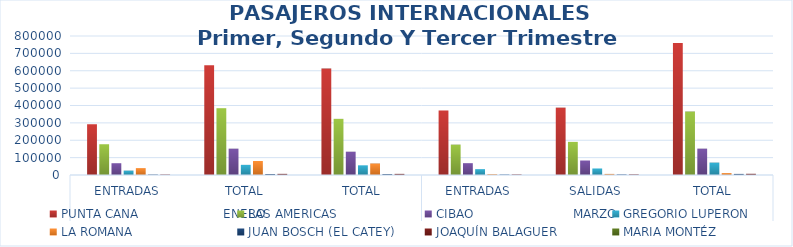
| Category | Series 0 | PUNTA CANA | LAS AMERICAS | CIBAO | GREGORIO LUPERON | LA ROMANA | JUAN BOSCH (EL CATEY) | JOAQUÍN BALAGUER | MARIA MONTÉZ |
|---|---|---|---|---|---|---|---|---|---|
| 0 |  | 292075 | 177067 | 67803 | 25212 | 39661 | 2610 | 2881 | 2 |
| 1 |  | 631955 | 384460 | 151453 | 58369 | 80531 | 5728 | 6563 | 10 |
| 2 |  | 612546 | 323088 | 134017 | 55751 | 66122 | 5481 | 6492 | 9 |
| 3 |  | 371356 | 174766 | 68083 | 33724 | 4810 | 2853 | 3228 | 1 |
| 4 |  | 387718 | 190545 | 83480 | 37607 | 6292 | 3441 | 3671 | 0 |
| 5 |  | 759074 | 365311 | 151563 | 71331 | 11102 | 6294 | 6899 | 1 |